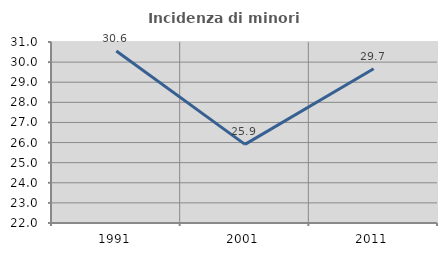
| Category | Incidenza di minori stranieri |
|---|---|
| 1991.0 | 30.556 |
| 2001.0 | 25.911 |
| 2011.0 | 29.667 |